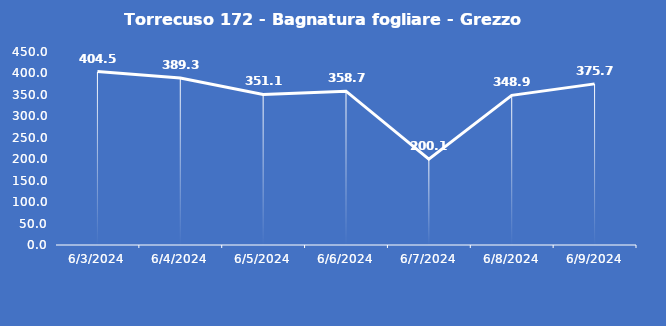
| Category | Torrecuso 172 - Bagnatura fogliare - Grezzo (min) |
|---|---|
| 6/3/24 | 404.5 |
| 6/4/24 | 389.3 |
| 6/5/24 | 351.1 |
| 6/6/24 | 358.7 |
| 6/7/24 | 200.1 |
| 6/8/24 | 348.9 |
| 6/9/24 | 375.7 |